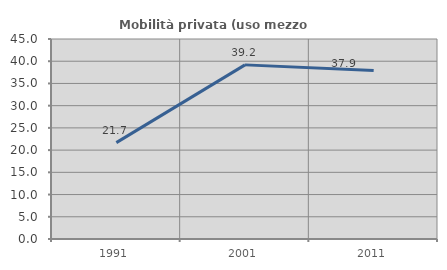
| Category | Mobilità privata (uso mezzo privato) |
|---|---|
| 1991.0 | 21.69 |
| 2001.0 | 39.178 |
| 2011.0 | 37.931 |